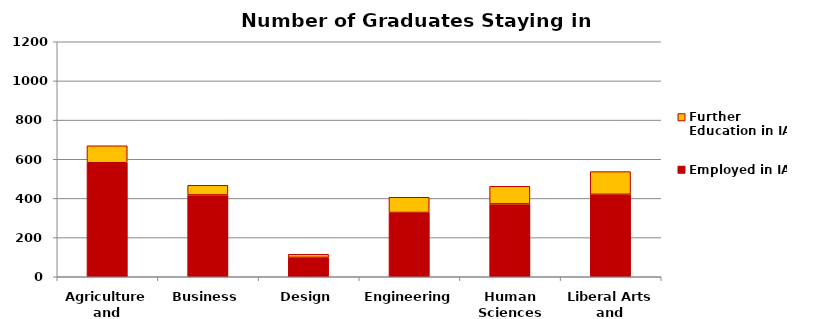
| Category | Employed in IA | Further Education in IA |
|---|---|---|
| Agriculture and
Life Sciences | 582 | 87 |
| Business | 418 | 49 |
| Design | 99 | 16 |
| Engineering | 328 | 78 |
| Human
Sciences | 372 | 90 |
| Liberal Arts and
Sciences | 421 | 116 |